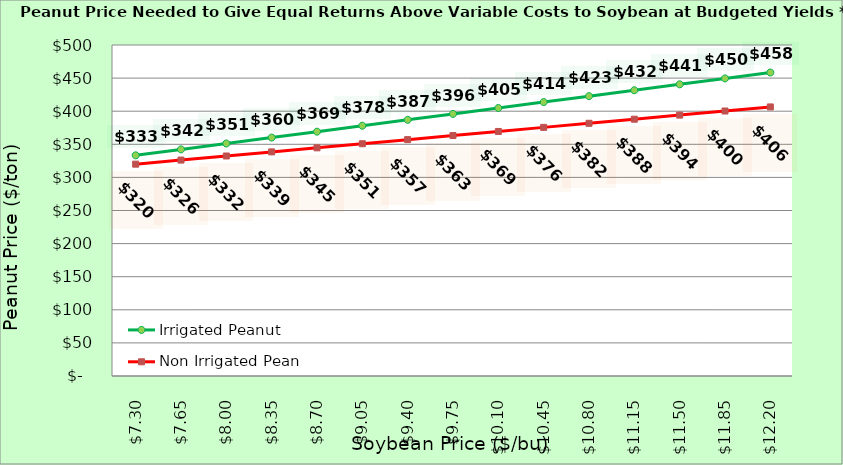
| Category | Irrigated Peanut | Non Irrigated Peanut |
|---|---|---|
| 7.3000000000000025 | 333.356 | 319.985 |
| 7.650000000000002 | 342.292 | 326.162 |
| 8.000000000000002 | 351.229 | 332.338 |
| 8.350000000000001 | 360.165 | 338.515 |
| 8.700000000000001 | 369.101 | 344.691 |
| 9.05 | 378.037 | 350.868 |
| 9.4 | 386.973 | 357.044 |
| 9.75 | 395.909 | 363.221 |
| 10.1 | 404.846 | 369.397 |
| 10.45 | 413.782 | 375.574 |
| 10.799999999999999 | 422.718 | 381.75 |
| 11.149999999999999 | 431.654 | 387.926 |
| 11.499999999999998 | 440.59 | 394.103 |
| 11.849999999999998 | 449.526 | 400.279 |
| 12.199999999999998 | 458.463 | 406.456 |